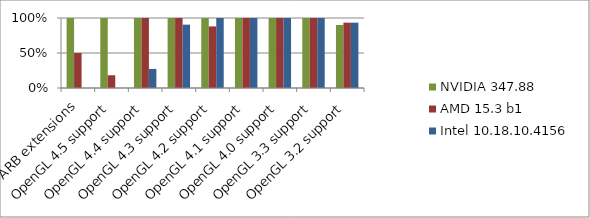
| Category | NVIDIA 347.88 | AMD 15.3 b1 | Intel 10.18.10.4156 |
|---|---|---|---|
| ARB extensions | 1 | 0.5 | 0 |
| OpenGL 4.5 support | 1 | 0.182 | 0 |
| OpenGL 4.4 support | 1 | 1 | 0.273 |
| OpenGL 4.3 support | 1 | 1 | 0.905 |
| OpenGL 4.2 support | 1 | 0.88 | 1 |
| OpenGL 4.1 support | 1 | 1 | 1 |
| OpenGL 4.0 support | 1 | 1 | 1 |
| OpenGL 3.3 support | 1 | 1 | 1 |
| OpenGL 3.2 support | 0.9 | 0.933 | 0.933 |